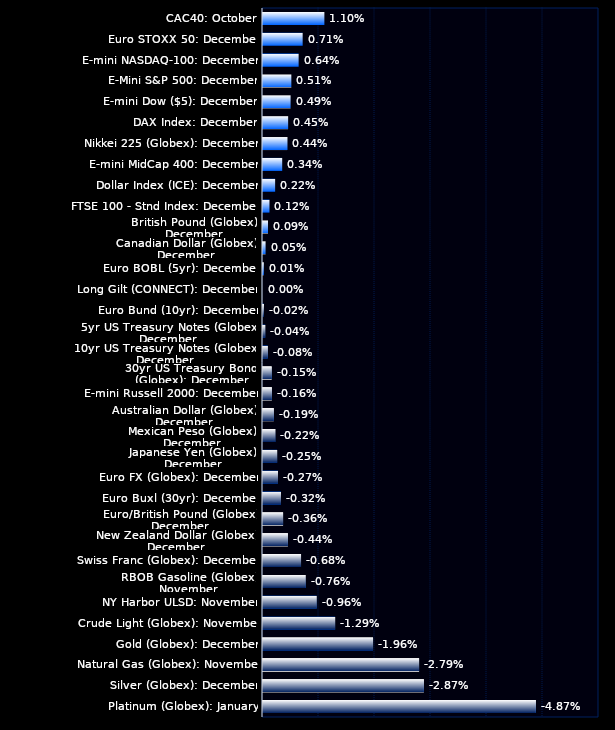
| Category | Series 0 | Series 1 |
|---|---|---|
| CAC40: October | 0.011 | 0 |
| Euro STOXX 50: December | 0.007 | 0 |
| E-mini NASDAQ-100: December | 0.006 | 0 |
| E-Mini S&P 500: December | 0.005 | 0 |
| E-mini Dow ($5): December | 0.005 | 0 |
| DAX Index: December | 0.004 | 0 |
| Nikkei 225 (Globex): December | 0.004 | 0 |
| E-mini MidCap 400: December | 0.003 | 0 |
| Dollar Index (ICE): December | 0.002 | 0 |
| FTSE 100 - Stnd Index: December | 0.001 | 0 |
| British Pound (Globex): December | 0.001 | 0 |
| Canadian Dollar (Globex): December | 0 | 0 |
| Euro BOBL (5yr): December | 0 | 0 |
| Long Gilt (CONNECT): December | 0 | 0 |
| Euro Bund (10yr): December | 0 | 0 |
| 5yr US Treasury Notes (Globex): December | 0 | 0 |
| 10yr US Treasury Notes (Globex): December | 0.001 | 0.001 |
| 30yr US Treasury Bonds (Globex): December | 0.002 | 0.002 |
| E-mini Russell 2000: December | 0.002 | 0.002 |
| Australian Dollar (Globex): December | 0.002 | 0.002 |
| Mexican Peso (Globex): December | 0.002 | 0.002 |
| Japanese Yen (Globex): December | 0.003 | 0.003 |
| Euro FX (Globex): December | 0.003 | 0.003 |
| Euro Buxl (30yr): December | 0.003 | 0.003 |
| Euro/British Pound (Globex): December | 0.004 | 0.004 |
| New Zealand Dollar (Globex): December | 0.004 | 0.004 |
| Swiss Franc (Globex): December | 0.007 | 0.007 |
| RBOB Gasoline (Globex): November | 0.008 | 0.008 |
| NY Harbor ULSD: November | 0.01 | 0.01 |
| Crude Light (Globex): November | 0.013 | 0.013 |
| Gold (Globex): December | 0.02 | 0.02 |
| Natural Gas (Globex): November | 0.028 | 0.028 |
| Silver (Globex): December | 0.029 | 0.029 |
| Platinum (Globex): January | 0.049 | 0.049 |